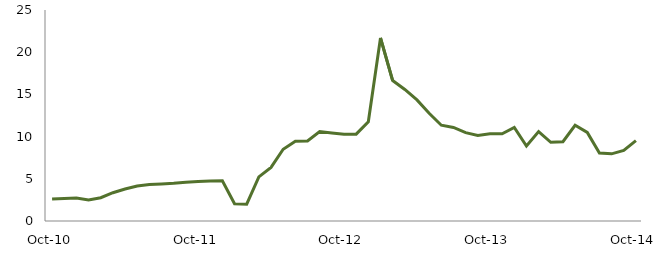
| Category | Series 0 |
|---|---|
| Oct-10 | 2.599 |
|  | 2.657 |
|  | 2.723 |
|  | 2.482 |
|  | 2.759 |
|  | 3.354 |
|  | 3.786 |
|  | 4.151 |
|  | 4.328 |
|  | 4.398 |
|  | 4.464 |
|  | 4.588 |
| Oct-11 | 4.679 |
|  | 4.725 |
|  | 4.771 |
|  | 2.048 |
|  | 1.991 |
|  | 5.225 |
|  | 6.354 |
|  | 8.497 |
|  | 9.463 |
|  | 9.491 |
|  | 10.603 |
|  | 10.425 |
| Oct-12 | 10.27 |
|  | 10.29 |
|  | 11.75 |
|  | 21.688 |
|  | 16.642 |
|  | 15.583 |
|  | 14.352 |
|  | 12.766 |
|  | 11.347 |
|  | 11.081 |
|  | 10.473 |
|  | 10.123 |
| Oct-13 | 10.344 |
|  | 10.337 |
|  | 11.09 |
|  | 8.878 |
|  | 10.595 |
|  | 9.33 |
|  | 9.398 |
|  | 11.339 |
|  | 10.501 |
|  | 8.045 |
|  | 7.955 |
|  | 8.359 |
| Oct-14 | 9.52 |